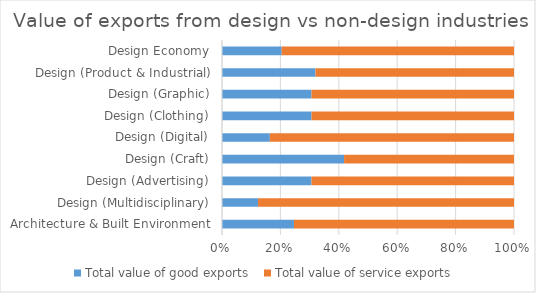
| Category | Total value of good exports  | Total value of service exports  |
|---|---|---|
| Architecture & Built Environment | 1752.427 | 5358 |
| Design (Multidisciplinary) | 379.845 | 2696 |
| Design (Advertising) | 417.298 | 944 |
| Design (Craft) | 593.449 | 826 |
| Design (Digital) | 7443.513 | 37971 |
| Design (Clothing) | 14.154 | 32 |
| Design (Graphic) | 544.378 | 1231 |
| Design (Product & Industrial) | 3225.052 | 6845 |
| Design Economy | 14370.116 | 55904 |